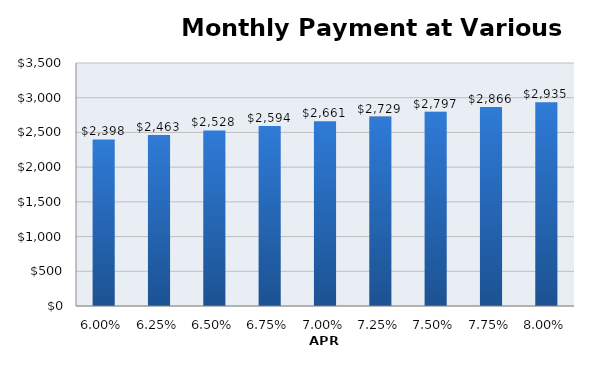
| Category | Mo Pmt |
|---|---|
| 0.06 | 2398.202 |
| 0.0625 | 2462.869 |
| 0.065 | 2528.272 |
| 0.0675 | 2594.392 |
| 0.07 | 2661.21 |
| 0.07250000000000001 | 2728.705 |
| 0.07500000000000001 | 2796.858 |
| 0.07750000000000001 | 2865.649 |
| 0.08000000000000002 | 2935.058 |